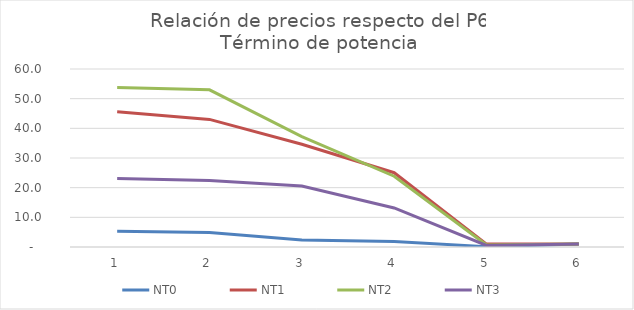
| Category | NT0 | NT1 | NT2 | NT3 |
|---|---|---|---|---|
| 0 | 5.272 | 45.586 | 53.779 | 23.064 |
| 1 | 4.874 | 43.009 | 52.987 | 22.439 |
| 2 | 2.339 | 34.635 | 37.2 | 20.528 |
| 3 | 1.858 | 25.041 | 23.851 | 13.166 |
| 4 | 0.11 | 0.976 | 0.673 | 0.51 |
| 5 | 1 | 1 | 1 | 1 |